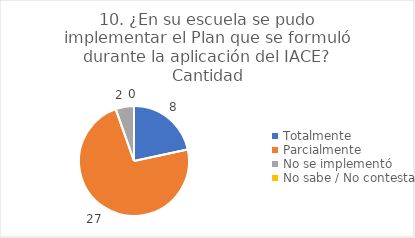
| Category | 10. ¿En su escuela se pudo implementar el Plan que se formuló durante la aplicación del IACE? |
|---|---|
| Totalmente  | 0.216 |
| Parcialmente  | 0.73 |
| No se implementó  | 0.054 |
| No sabe / No contesta | 0 |